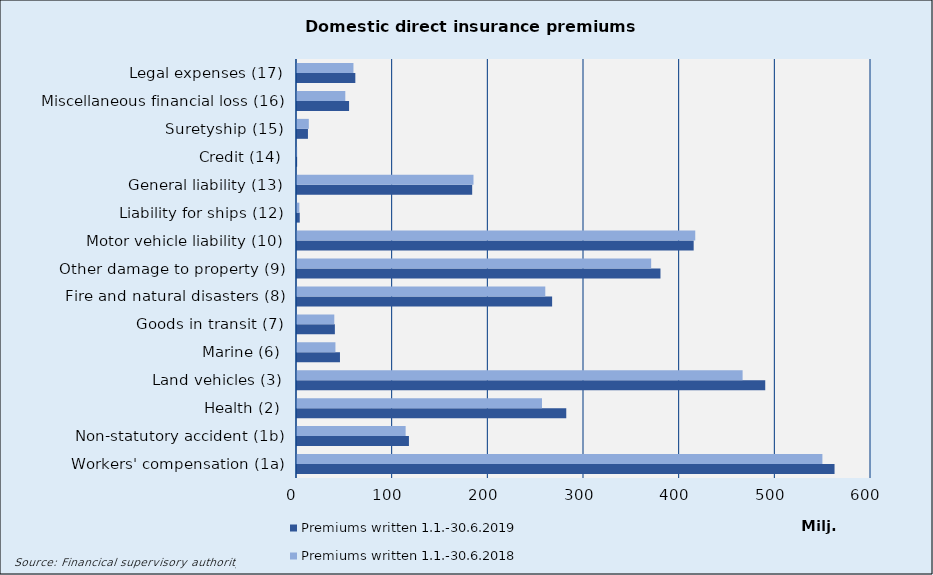
| Category | Premiums written |
|---|---|
| Workers' compensation (1a) | 549203.912 |
| Non-statutory accident (1b) | 113559.162 |
| Health (2) | 256082.763 |
| Land vehicles (3) | 465785.923 |
| Marine (6) | 40167.904 |
| Goods in transit (7) | 38987.667 |
| Fire and natural disasters (8) | 259536.578 |
| Other damage to property (9) | 370203.097 |
| Motor vehicle liability (10) | 416293.365 |
| Liability for ships (12) | 2468.44 |
| General liability (13) | 184474.955 |
| Credit (14) | 140.949 |
| Suretyship (15) | 12339.334 |
| Miscellaneous financial loss (16) | 50491.37 |
| Legal expenses (17) | 59005.338 |